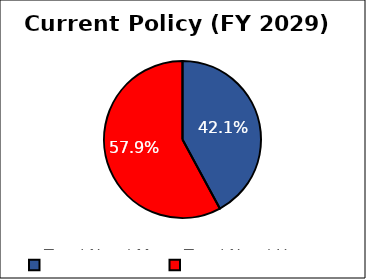
| Category | Current
Policy |
|---|---|
| Total Need Met | 0.421 |
| Total Need Unmet | 0.579 |